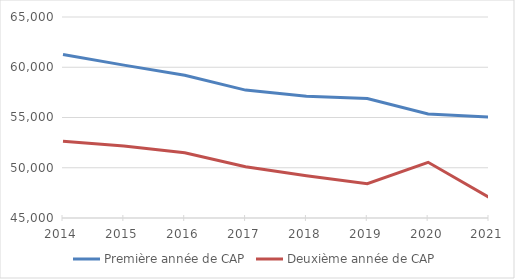
| Category | Première année de CAP | Deuxième année de CAP |
|---|---|---|
| 2014.0 | 61269 | 52645 |
| 2015.0 | 60213 | 52158 |
| 2016.0 | 59202 | 51490 |
| 2017.0 | 57727 | 50096 |
| 2018.0 | 57125 | 49203 |
| 2019.0 | 56897 | 48412 |
| 2020.0 | 55348 | 50544 |
| 2021.0 | 55053 | 47062 |